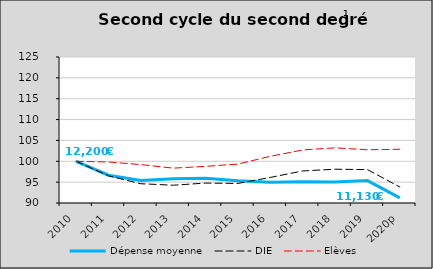
| Category | Dépense moyenne  | DIE  | Elèves |
|---|---|---|---|
| 2010 | 100 | 100 | 100 |
| 2011 | 96.67 | 96.509 | 99.833 |
| 2012 | 95.381 | 94.619 | 99.201 |
| 2013 | 95.836 | 94.263 | 98.359 |
| 2014 | 95.943 | 94.778 | 98.786 |
| 2015 | 95.326 | 94.694 | 99.338 |
| 2016 | 94.993 | 96.131 | 101.198 |
| 2017 | 95.102 | 97.685 | 102.717 |
| 2018 | 95.038 | 98.099 | 103.222 |
| 2019 | 95.372 | 98.007 | 102.763 |
| 2020p | 91.221 | 93.849 | 102.881 |